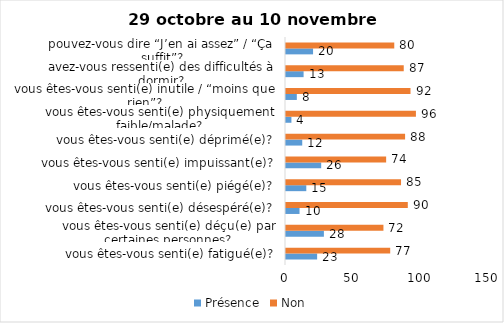
| Category | Présence | Non |
|---|---|---|
| vous êtes-vous senti(e) fatigué(e)? | 23 | 77 |
| vous êtes-vous senti(e) déçu(e) par certaines personnes? | 28 | 72 |
| vous êtes-vous senti(e) désespéré(e)? | 10 | 90 |
| vous êtes-vous senti(e) piégé(e)? | 15 | 85 |
| vous êtes-vous senti(e) impuissant(e)? | 26 | 74 |
| vous êtes-vous senti(e) déprimé(e)? | 12 | 88 |
| vous êtes-vous senti(e) physiquement faible/malade? | 4 | 96 |
| vous êtes-vous senti(e) inutile / “moins que rien”? | 8 | 92 |
| avez-vous ressenti(e) des difficultés à dormir? | 13 | 87 |
| pouvez-vous dire “J’en ai assez” / “Ça suffit”? | 20 | 80 |